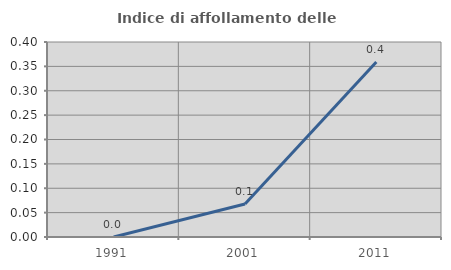
| Category | Indice di affollamento delle abitazioni  |
|---|---|
| 1991.0 | 0 |
| 2001.0 | 0.068 |
| 2011.0 | 0.359 |